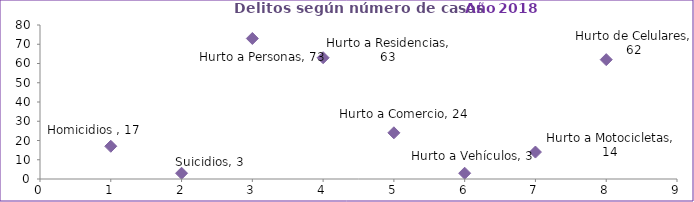
| Category | Series 0 |
|---|---|
| 0 | 17 |
| 1 | 3 |
| 2 | 73 |
| 3 | 63 |
| 4 | 24 |
| 5 | 3 |
| 6 | 14 |
| 7 | 62 |